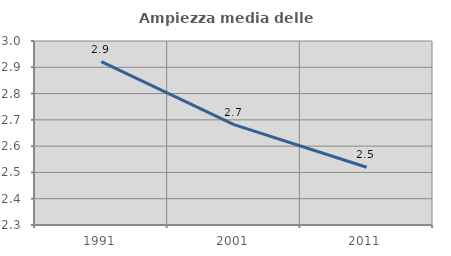
| Category | Ampiezza media delle famiglie |
|---|---|
| 1991.0 | 2.921 |
| 2001.0 | 2.682 |
| 2011.0 | 2.52 |